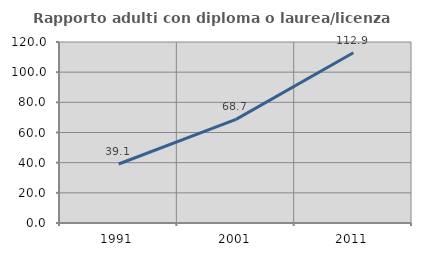
| Category | Rapporto adulti con diploma o laurea/licenza media  |
|---|---|
| 1991.0 | 39.128 |
| 2001.0 | 68.724 |
| 2011.0 | 112.871 |